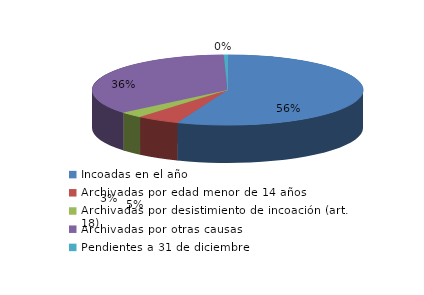
| Category | Series 0 |
|---|---|
| Incoadas en el año | 383 |
| Archivadas por edad menor de 14 años | 35 |
| Archivadas por desistimiento de incoación (art. 18) | 19 |
| Archivadas por otras causas | 244 |
| Pendientes a 31 de diciembre | 3 |